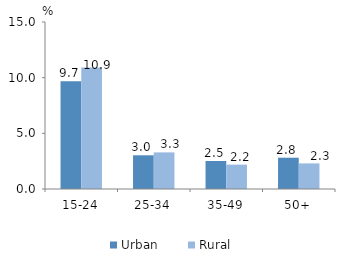
| Category | Urban | Rural |
|---|---|---|
| 15-24 | 9.68 | 10.912 |
| 25-34 | 3.028 | 3.289 |
| 35-49 | 2.515 | 2.187 |
| 50+ | 2.81 | 2.3 |